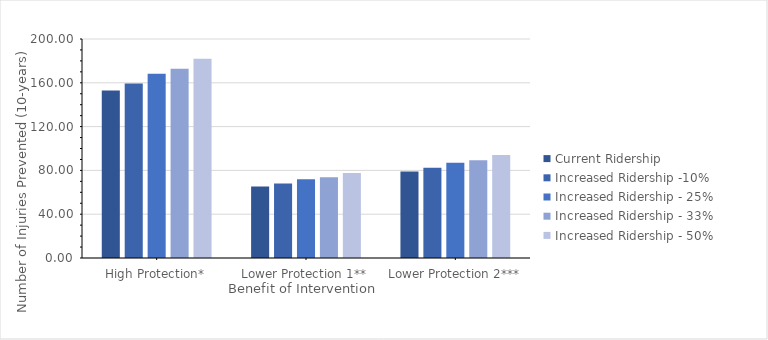
| Category | Current Ridership | Increased Ridership -10% | Increased Ridership - 25% | Increased Ridership - 33% | Increased Ridership - 50% |
|---|---|---|---|---|---|
| High Protection* | 152.901 | 159.298 | 168.299 | 172.849 | 182.024 |
| Lower Protection 1** | 65.284 | 68.015 | 71.858 | 73.801 | 77.718 |
| Lower Protection 2*** | 79.028 | 82.334 | 86.986 | 89.338 | 94.08 |